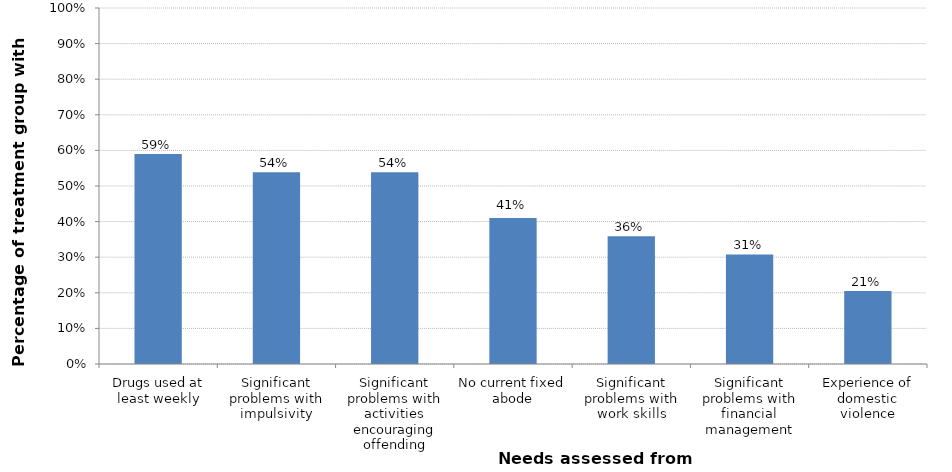
| Category | Percentage of treatment group with need |
|---|---|
| Drugs used at least weekly | 0.59 |
| Significant problems with impulsivity | 0.538 |
| Significant problems with activities encouraging offending | 0.538 |
| No current fixed abode | 0.41 |
| Significant problems with work skills | 0.359 |
| Significant problems with financial management | 0.308 |
| Experience of domestic violence | 0.205 |